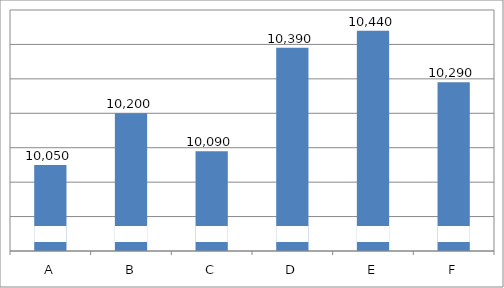
| Category | Umsatz, T€ |
|---|---|
| A | 10050 |
| B | 10200 |
| C | 10090 |
| D | 10390 |
| E | 10440 |
| F | 10290 |